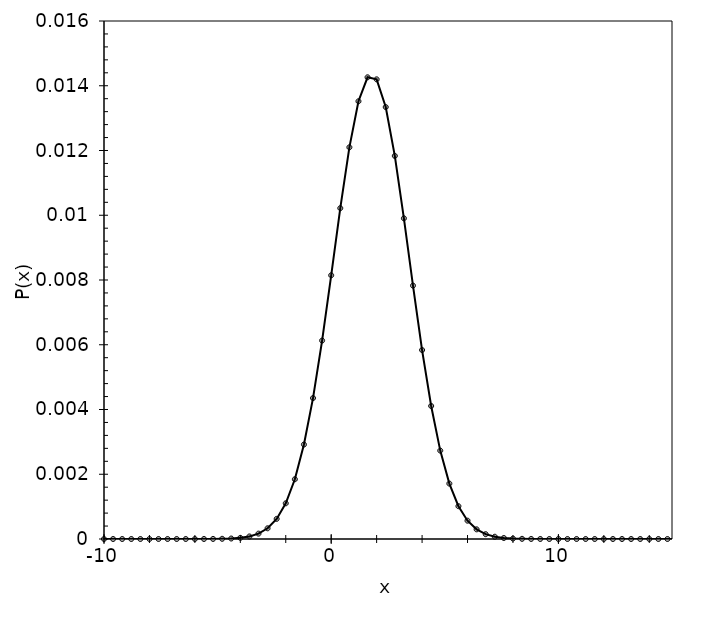
| Category | Product |
|---|---|
| -12.0 | 0 |
| -11.6 | 0 |
| -11.2 | 0 |
| -10.799999999999999 | 0 |
| -10.399999999999999 | 0 |
| -9.999999999999998 | 0 |
| -9.599999999999998 | 0 |
| -9.199999999999998 | 0 |
| -8.799999999999997 | 0 |
| -8.399999999999997 | 0 |
| -7.9999999999999964 | 0 |
| -7.599999999999996 | 0 |
| -7.199999999999996 | 0 |
| -6.799999999999995 | 0 |
| -6.399999999999995 | 0 |
| -5.999999999999995 | 0 |
| -5.599999999999994 | 0 |
| -5.199999999999994 | 0 |
| -4.799999999999994 | 0 |
| -4.399999999999993 | 0 |
| -3.9999999999999933 | 0 |
| -3.5999999999999934 | 0 |
| -3.1999999999999935 | 0 |
| -2.7999999999999936 | 0 |
| -2.3999999999999937 | 0.001 |
| -1.9999999999999938 | 0.001 |
| -1.5999999999999939 | 0.002 |
| -1.199999999999994 | 0.003 |
| -0.7999999999999939 | 0.004 |
| -0.3999999999999939 | 0.006 |
| 6.106226635438361e-15 | 0.008 |
| 0.40000000000000613 | 0.01 |
| 0.8000000000000062 | 0.012 |
| 1.2000000000000062 | 0.014 |
| 1.6000000000000063 | 0.014 |
| 2.000000000000006 | 0.014 |
| 2.400000000000006 | 0.013 |
| 2.800000000000006 | 0.012 |
| 3.200000000000006 | 0.01 |
| 3.600000000000006 | 0.008 |
| 4.000000000000006 | 0.006 |
| 4.400000000000007 | 0.004 |
| 4.800000000000007 | 0.003 |
| 5.200000000000007 | 0.002 |
| 5.600000000000008 | 0.001 |
| 6.000000000000008 | 0.001 |
| 6.400000000000008 | 0 |
| 6.800000000000009 | 0 |
| 7.200000000000009 | 0 |
| 7.600000000000009 | 0 |
| 8.000000000000009 | 0 |
| 8.40000000000001 | 0 |
| 8.80000000000001 | 0 |
| 9.20000000000001 | 0 |
| 9.60000000000001 | 0 |
| 10.00000000000001 | 0 |
| 10.400000000000011 | 0 |
| 10.800000000000011 | 0 |
| 11.200000000000012 | 0 |
| 11.600000000000012 | 0 |
| 12.000000000000012 | 0 |
| 12.400000000000013 | 0 |
| 12.800000000000013 | 0 |
| 13.200000000000014 | 0 |
| 13.600000000000014 | 0 |
| 14.000000000000014 | 0 |
| 14.400000000000015 | 0 |
| 14.800000000000015 | 0 |
| 15.200000000000015 | 0 |
| 15.600000000000016 | 0 |
| 16.000000000000014 | 0 |
| 16.400000000000013 | 0 |
| 16.80000000000001 | 0 |
| 17.20000000000001 | 0 |
| 17.60000000000001 | 0 |
| 18.000000000000007 | 0 |
| 18.400000000000006 | 0 |
| 18.800000000000004 | 0 |
| 19.200000000000003 | 0 |
| 19.6 | 0 |
| 20.0 | 0 |
| 20.4 | 0 |
| 20.799999999999997 | 0 |
| 21.199999999999996 | 0 |
| 21.599999999999994 | 0 |
| 21.999999999999993 | 0 |
| 22.39999999999999 | 0 |
| 22.79999999999999 | 0 |
| 23.19999999999999 | 0 |
| 23.599999999999987 | 0 |
| 23.999999999999986 | 0 |
| 24.399999999999984 | 0 |
| 24.799999999999983 | 0 |
| 25.19999999999998 | 0 |
| 25.59999999999998 | 0 |
| 25.99999999999998 | 0 |
| 26.399999999999977 | 0 |
| 26.799999999999976 | 0 |
| 27.199999999999974 | 0 |
| 27.599999999999973 | 0 |
| 27.99999999999997 | 0 |
| 28.39999999999997 | 0 |
| 28.79999999999997 | 0 |
| 29.199999999999967 | 0 |
| 29.599999999999966 | 0 |
| 29.999999999999964 | 0 |
| 30.399999999999963 | 0 |
| 30.79999999999996 | 0 |
| 31.19999999999996 | 0 |
| 31.59999999999996 | 0 |
| 31.999999999999957 | 0 |
| 32.399999999999956 | 0 |
| 32.799999999999955 | 0 |
| 33.19999999999995 | 0 |
| 33.59999999999995 | 0 |
| 33.99999999999995 | 0 |
| 34.39999999999995 | 0 |
| 34.79999999999995 | 0 |
| 35.199999999999946 | 0 |
| 35.599999999999945 | 0 |
| 35.99999999999994 | 0 |
| 36.39999999999994 | 0 |
| 36.79999999999994 | 0 |
| 37.19999999999994 | 0 |
| 37.59999999999994 | 0 |
| 37.999999999999936 | 0 |
| 38.399999999999935 | 0 |
| 38.79999999999993 | 0 |
| 39.19999999999993 | 0 |
| 39.59999999999993 | 0 |
| 39.99999999999993 | 0 |
| 40.39999999999993 | 0 |
| 40.799999999999926 | 0 |
| 41.199999999999925 | 0 |
| 41.59999999999992 | 0 |
| 41.99999999999992 | 0 |
| 42.39999999999992 | 0 |
| 42.79999999999992 | 0 |
| 43.19999999999992 | 0 |
| 43.599999999999916 | 0 |
| 43.999999999999915 | 0 |
| 44.39999999999991 | 0 |
| 44.79999999999991 | 0 |
| 45.19999999999991 | 0 |
| 45.59999999999991 | 0 |
| 45.99999999999991 | 0 |
| 46.399999999999906 | 0 |
| 46.799999999999905 | 0 |
| 47.1999999999999 | 0 |
| 47.5999999999999 | 0 |
| 47.9999999999999 | 0 |
| 48.3999999999999 | 0 |
| 48.7999999999999 | 0 |
| 49.199999999999896 | 0 |
| 49.599999999999895 | 0 |
| 49.99999999999989 | 0 |
| 50.39999999999989 | 0 |
| 50.79999999999989 | 0 |
| 51.19999999999989 | 0 |
| 51.59999999999989 | 0 |
| 51.999999999999886 | 0 |
| 52.399999999999885 | 0 |
| 52.79999999999988 | 0 |
| 53.19999999999988 | 0 |
| 53.59999999999988 | 0 |
| 53.99999999999988 | 0 |
| 54.39999999999988 | 0 |
| 54.799999999999876 | 0 |
| 55.199999999999875 | 0 |
| 55.59999999999987 | 0 |
| 55.99999999999987 | 0 |
| 56.39999999999987 | 0 |
| 56.79999999999987 | 0 |
| 57.19999999999987 | 0 |
| 57.599999999999866 | 0 |
| 57.999999999999865 | 0 |
| 58.399999999999864 | 0 |
| 58.79999999999986 | 0 |
| 59.19999999999986 | 0 |
| 59.59999999999986 | 0 |
| 59.99999999999986 | 0 |
| 60.39999999999986 | 0 |
| 60.799999999999855 | 0 |
| 61.199999999999854 | 0 |
| 61.59999999999985 | 0 |
| 61.99999999999985 | 0 |
| 62.39999999999985 | 0 |
| 62.79999999999985 | 0 |
| 63.19999999999985 | 0 |
| 63.599999999999845 | 0 |
| 63.999999999999844 | 0 |
| 64.39999999999985 | 0 |
| 64.79999999999986 | 0 |
| 65.19999999999986 | 0 |
| 65.59999999999987 | 0 |
| 65.99999999999987 | 0 |
| 66.39999999999988 | 0 |
| 66.79999999999988 | 0 |
| 67.19999999999989 | 0 |
| 67.5999999999999 | 0 |
| 67.9999999999999 | 0 |
| 68.3999999999999 | 0 |
| 68.79999999999991 | 0 |
| 69.19999999999992 | 0 |
| 69.59999999999992 | 0 |
| 69.99999999999993 | 0 |
| 70.39999999999993 | 0 |
| 70.79999999999994 | 0 |
| 71.19999999999995 | 0 |
| 71.59999999999995 | 0 |
| 71.99999999999996 | 0 |
| 72.39999999999996 | 0 |
| 72.79999999999997 | 0 |
| 73.19999999999997 | 0 |
| 73.59999999999998 | 0 |
| 73.99999999999999 | 0 |
| 74.39999999999999 | 0 |
| 74.8 | 0 |
| 75.2 | 0 |
| 75.60000000000001 | 0 |
| 76.00000000000001 | 0 |
| 76.40000000000002 | 0 |
| 76.80000000000003 | 0 |
| 77.20000000000003 | 0 |
| 77.60000000000004 | 0 |
| 78.00000000000004 | 0 |
| 78.40000000000005 | 0 |
| 78.80000000000005 | 0 |
| 79.20000000000006 | 0 |
| 79.60000000000007 | 0 |
| 80.00000000000007 | 0 |
| 80.40000000000008 | 0 |
| 80.80000000000008 | 0 |
| 81.20000000000009 | 0 |
| 81.6000000000001 | 0 |
| 82.0000000000001 | 0 |
| 82.4000000000001 | 0 |
| 82.80000000000011 | 0 |
| 83.20000000000012 | 0 |
| 83.60000000000012 | 0 |
| 84.00000000000013 | 0 |
| 84.40000000000013 | 0 |
| 84.80000000000014 | 0 |
| 85.20000000000014 | 0 |
| 85.60000000000015 | 0 |
| 86.00000000000016 | 0 |
| 86.40000000000016 | 0 |
| 86.80000000000017 | 0 |
| 87.20000000000017 | 0 |
| 87.60000000000018 | 0 |
| 88.00000000000018 | 0 |
| 88.40000000000019 | 0 |
| 88.8000000000002 | 0 |
| 89.2000000000002 | 0 |
| 89.60000000000021 | 0 |
| 90.00000000000021 | 0 |
| 90.40000000000022 | 0 |
| 90.80000000000022 | 0 |
| 91.20000000000023 | 0 |
| 91.60000000000024 | 0 |
| 92.00000000000024 | 0 |
| 92.40000000000025 | 0 |
| 92.80000000000025 | 0 |
| 93.20000000000026 | 0 |
| 93.60000000000026 | 0 |
| 94.00000000000027 | 0 |
| 94.40000000000028 | 0 |
| 94.80000000000028 | 0 |
| 95.20000000000029 | 0 |
| 95.60000000000029 | 0 |
| 96.0000000000003 | 0 |
| 96.4000000000003 | 0 |
| 96.80000000000031 | 0 |
| 97.20000000000032 | 0 |
| 97.60000000000032 | 0 |
| 98.00000000000033 | 0 |
| 98.40000000000033 | 0 |
| 98.80000000000034 | 0 |
| 99.20000000000034 | 0 |
| 99.60000000000035 | 0 |
| 100.00000000000036 | 0 |
| 100.40000000000036 | 0 |
| 100.80000000000037 | 0 |
| 101.20000000000037 | 0 |
| 101.60000000000038 | 0 |
| 102.00000000000038 | 0 |
| 102.40000000000039 | 0 |
| 102.8000000000004 | 0 |
| 103.2000000000004 | 0 |
| 103.6000000000004 | 0 |
| 104.00000000000041 | 0 |
| 104.40000000000042 | 0 |
| 104.80000000000042 | 0 |
| 105.20000000000043 | 0 |
| 105.60000000000043 | 0 |
| 106.00000000000044 | 0 |
| 106.40000000000045 | 0 |
| 106.80000000000045 | 0 |
| 107.20000000000046 | 0 |
| 107.60000000000046 | 0 |
| 108.00000000000047 | 0 |
| 108.40000000000047 | 0 |
| 108.80000000000048 | 0 |
| 109.20000000000049 | 0 |
| 109.60000000000049 | 0 |
| 110.0000000000005 | 0 |
| 110.4000000000005 | 0 |
| 110.80000000000051 | 0 |
| 111.20000000000051 | 0 |
| 111.60000000000052 | 0 |
| 112.00000000000053 | 0 |
| 112.40000000000053 | 0 |
| 112.80000000000054 | 0 |
| 113.20000000000054 | 0 |
| 113.60000000000055 | 0 |
| 114.00000000000055 | 0 |
| 114.40000000000056 | 0 |
| 114.80000000000057 | 0 |
| 115.20000000000057 | 0 |
| 115.60000000000058 | 0 |
| 116.00000000000058 | 0 |
| 116.40000000000059 | 0 |
| 116.8000000000006 | 0 |
| 117.2000000000006 | 0 |
| 117.6000000000006 | 0 |
| 118.00000000000061 | 0 |
| 118.40000000000062 | 0 |
| 118.80000000000062 | 0 |
| 119.20000000000063 | 0 |
| 119.60000000000063 | 0 |
| 120.00000000000064 | 0 |
| 120.40000000000065 | 0 |
| 120.80000000000065 | 0 |
| 121.20000000000066 | 0 |
| 121.60000000000066 | 0 |
| 122.00000000000067 | 0 |
| 122.40000000000067 | 0 |
| 122.80000000000068 | 0 |
| 123.20000000000068 | 0 |
| 123.60000000000069 | 0 |
| 124.0000000000007 | 0 |
| 124.4000000000007 | 0 |
| 124.80000000000071 | 0 |
| 125.20000000000071 | 0 |
| 125.60000000000072 | 0 |
| 126.00000000000072 | 0 |
| 126.40000000000073 | 0 |
| 126.80000000000074 | 0 |
| 127.20000000000074 | 0 |
| 127.60000000000075 | 0 |
| 128.00000000000074 | 0 |
| 128.40000000000074 | 0 |
| 128.80000000000075 | 0 |
| 129.20000000000076 | 0 |
| 129.60000000000076 | 0 |
| 130.00000000000077 | 0 |
| 130.40000000000077 | 0 |
| 130.80000000000078 | 0 |
| 131.20000000000078 | 0 |
| 131.6000000000008 | 0 |
| 132.0000000000008 | 0 |
| 132.4000000000008 | 0 |
| 132.8000000000008 | 0 |
| 133.2000000000008 | 0 |
| 133.60000000000082 | 0 |
| 134.00000000000082 | 0 |
| 134.40000000000083 | 0 |
| 134.80000000000084 | 0 |
| 135.20000000000084 | 0 |
| 135.60000000000085 | 0 |
| 136.00000000000085 | 0 |
| 136.40000000000086 | 0 |
| 136.80000000000086 | 0 |
| 137.20000000000087 | 0 |
| 137.60000000000088 | 0 |
| 138.00000000000088 | 0 |
| 138.4000000000009 | 0 |
| 138.8000000000009 | 0 |
| 139.2000000000009 | 0 |
| 139.6000000000009 | 0 |
| 140.0000000000009 | 0 |
| 140.40000000000092 | 0 |
| 140.80000000000092 | 0 |
| 141.20000000000093 | 0 |
| 141.60000000000093 | 0 |
| 142.00000000000094 | 0 |
| 142.40000000000094 | 0 |
| 142.80000000000095 | 0 |
| 143.20000000000095 | 0 |
| 143.60000000000096 | 0 |
| 144.00000000000097 | 0 |
| 144.40000000000097 | 0 |
| 144.80000000000098 | 0 |
| 145.20000000000098 | 0 |
| 145.600000000001 | 0 |
| 146.000000000001 | 0 |
| 146.400000000001 | 0 |
| 146.800000000001 | 0 |
| 147.200000000001 | 0 |
| 147.60000000000102 | 0 |
| 148.00000000000102 | 0 |
| 148.40000000000103 | 0 |
| 148.80000000000103 | 0 |
| 149.20000000000104 | 0 |
| 149.60000000000105 | 0 |
| 150.00000000000105 | 0 |
| 150.40000000000106 | 0 |
| 150.80000000000106 | 0 |
| 151.20000000000107 | 0 |
| 151.60000000000107 | 0 |
| 152.00000000000108 | 0 |
| 152.40000000000109 | 0 |
| 152.8000000000011 | 0 |
| 153.2000000000011 | 0 |
| 153.6000000000011 | 0 |
| 154.0000000000011 | 0 |
| 154.4000000000011 | 0 |
| 154.80000000000112 | 0 |
| 155.20000000000113 | 0 |
| 155.60000000000113 | 0 |
| 156.00000000000114 | 0 |
| 156.40000000000114 | 0 |
| 156.80000000000115 | 0 |
| 157.20000000000115 | 0 |
| 157.60000000000116 | 0 |
| 158.00000000000117 | 0 |
| 158.40000000000117 | 0 |
| 158.80000000000118 | 0 |
| 159.20000000000118 | 0 |
| 159.6000000000012 | 0 |
| 160.0000000000012 | 0 |
| 160.4000000000012 | 0 |
| 160.8000000000012 | 0 |
| 161.2000000000012 | 0 |
| 161.60000000000122 | 0 |
| 162.00000000000122 | 0 |
| 162.40000000000123 | 0 |
| 162.80000000000123 | 0 |
| 163.20000000000124 | 0 |
| 163.60000000000124 | 0 |
| 164.00000000000125 | 0 |
| 164.40000000000126 | 0 |
| 164.80000000000126 | 0 |
| 165.20000000000127 | 0 |
| 165.60000000000127 | 0 |
| 166.00000000000128 | 0 |
| 166.40000000000128 | 0 |
| 166.8000000000013 | 0 |
| 167.2000000000013 | 0 |
| 167.6000000000013 | 0 |
| 168.0000000000013 | 0 |
| 168.4000000000013 | 0 |
| 168.80000000000132 | 0 |
| 169.20000000000132 | 0 |
| 169.60000000000133 | 0 |
| 170.00000000000134 | 0 |
| 170.40000000000134 | 0 |
| 170.80000000000135 | 0 |
| 171.20000000000135 | 0 |
| 171.60000000000136 | 0 |
| 172.00000000000136 | 0 |
| 172.40000000000137 | 0 |
| 172.80000000000138 | 0 |
| 173.20000000000138 | 0 |
| 173.6000000000014 | 0 |
| 174.0000000000014 | 0 |
| 174.4000000000014 | 0 |
| 174.8000000000014 | 0 |
| 175.2000000000014 | 0 |
| 175.60000000000142 | 0 |
| 176.00000000000142 | 0 |
| 176.40000000000143 | 0 |
| 176.80000000000143 | 0 |
| 177.20000000000144 | 0 |
| 177.60000000000144 | 0 |
| 178.00000000000145 | 0 |
| 178.40000000000146 | 0 |
| 178.80000000000146 | 0 |
| 179.20000000000147 | 0 |
| 179.60000000000147 | 0 |
| 180.00000000000148 | 0 |
| 180.40000000000148 | 0 |
| 180.8000000000015 | 0 |
| 181.2000000000015 | 0 |
| 181.6000000000015 | 0 |
| 182.0000000000015 | 0 |
| 182.4000000000015 | 0 |
| 182.80000000000152 | 0 |
| 183.20000000000152 | 0 |
| 183.60000000000153 | 0 |
| 184.00000000000153 | 0 |
| 184.40000000000154 | 0 |
| 184.80000000000155 | 0 |
| 185.20000000000155 | 0 |
| 185.60000000000156 | 0 |
| 186.00000000000156 | 0 |
| 186.40000000000157 | 0 |
| 186.80000000000157 | 0 |
| 187.20000000000158 | 0 |
| 187.6000000000016 | 0 |
| 188.0000000000016 | 0 |
| 188.4000000000016 | 0 |
| 188.8000000000016 | 0 |
| 189.2000000000016 | 0 |
| 189.60000000000161 | 0 |
| 190.00000000000162 | 0 |
| 190.40000000000163 | 0 |
| 190.80000000000163 | 0 |
| 191.20000000000164 | 0 |
| 191.60000000000164 | 0 |
| 192.00000000000165 | 0 |
| 192.40000000000165 | 0 |
| 192.80000000000166 | 0 |
| 193.20000000000167 | 0 |
| 193.60000000000167 | 0 |
| 194.00000000000168 | 0 |
| 194.40000000000168 | 0 |
| 194.8000000000017 | 0 |
| 195.2000000000017 | 0 |
| 195.6000000000017 | 0 |
| 196.0000000000017 | 0 |
| 196.4000000000017 | 0 |
| 196.80000000000172 | 0 |
| 197.20000000000172 | 0 |
| 197.60000000000173 | 0 |
| 198.00000000000173 | 0 |
| 198.40000000000174 | 0 |
| 198.80000000000175 | 0 |
| 199.20000000000175 | 0 |
| 199.60000000000176 | 0 |
| 200.00000000000176 | 0 |
| 200.40000000000177 | 0 |
| 200.80000000000177 | 0 |
| 201.20000000000178 | 0 |
| 201.60000000000178 | 0 |
| 202.0000000000018 | 0 |
| 202.4000000000018 | 0 |
| 202.8000000000018 | 0 |
| 203.2000000000018 | 0 |
| 203.6000000000018 | 0 |
| 204.00000000000182 | 0 |
| 204.40000000000182 | 0 |
| 204.80000000000183 | 0 |
| 205.20000000000184 | 0 |
| 205.60000000000184 | 0 |
| 206.00000000000185 | 0 |
| 206.40000000000185 | 0 |
| 206.80000000000186 | 0 |
| 207.20000000000186 | 0 |
| 207.60000000000187 | 0 |
| 208.00000000000188 | 0 |
| 208.40000000000188 | 0 |
| 208.8000000000019 | 0 |
| 209.2000000000019 | 0 |
| 209.6000000000019 | 0 |
| 210.0000000000019 | 0 |
| 210.4000000000019 | 0 |
| 210.80000000000192 | 0 |
| 211.20000000000192 | 0 |
| 211.60000000000193 | 0 |
| 212.00000000000193 | 0 |
| 212.40000000000194 | 0 |
| 212.80000000000194 | 0 |
| 213.20000000000195 | 0 |
| 213.60000000000196 | 0 |
| 214.00000000000196 | 0 |
| 214.40000000000197 | 0 |
| 214.80000000000197 | 0 |
| 215.20000000000198 | 0 |
| 215.60000000000198 | 0 |
| 216.000000000002 | 0 |
| 216.400000000002 | 0 |
| 216.800000000002 | 0 |
| 217.200000000002 | 0 |
| 217.600000000002 | 0 |
| 218.00000000000202 | 0 |
| 218.40000000000202 | 0 |
| 218.80000000000203 | 0 |
| 219.20000000000203 | 0 |
| 219.60000000000204 | 0 |
| 220.00000000000205 | 0 |
| 220.40000000000205 | 0 |
| 220.80000000000206 | 0 |
| 221.20000000000206 | 0 |
| 221.60000000000207 | 0 |
| 222.00000000000207 | 0 |
| 222.40000000000208 | 0 |
| 222.8000000000021 | 0 |
| 223.2000000000021 | 0 |
| 223.6000000000021 | 0 |
| 224.0000000000021 | 0 |
| 224.4000000000021 | 0 |
| 224.80000000000211 | 0 |
| 225.20000000000212 | 0 |
| 225.60000000000213 | 0 |
| 226.00000000000213 | 0 |
| 226.40000000000214 | 0 |
| 226.80000000000214 | 0 |
| 227.20000000000215 | 0 |
| 227.60000000000215 | 0 |
| 228.00000000000216 | 0 |
| 228.40000000000217 | 0 |
| 228.80000000000217 | 0 |
| 229.20000000000218 | 0 |
| 229.60000000000218 | 0 |
| 230.0000000000022 | 0 |
| 230.4000000000022 | 0 |
| 230.8000000000022 | 0 |
| 231.2000000000022 | 0 |
| 231.6000000000022 | 0 |
| 232.00000000000222 | 0 |
| 232.40000000000222 | 0 |
| 232.80000000000223 | 0 |
| 233.20000000000223 | 0 |
| 233.60000000000224 | 0 |
| 234.00000000000225 | 0 |
| 234.40000000000225 | 0 |
| 234.80000000000226 | 0 |
| 235.20000000000226 | 0 |
| 235.60000000000227 | 0 |
| 236.00000000000227 | 0 |
| 236.40000000000228 | 0 |
| 236.80000000000229 | 0 |
| 237.2000000000023 | 0 |
| 237.6000000000023 | 0 |
| 238.0000000000023 | 0 |
| 238.4000000000023 | 0 |
| 238.8000000000023 | 0 |
| 239.20000000000232 | 0 |
| 239.60000000000232 | 0 |
| 240.00000000000233 | 0 |
| 240.40000000000234 | 0 |
| 240.80000000000234 | 0 |
| 241.20000000000235 | 0 |
| 241.60000000000235 | 0 |
| 242.00000000000236 | 0 |
| 242.40000000000236 | 0 |
| 242.80000000000237 | 0 |
| 243.20000000000238 | 0 |
| 243.60000000000238 | 0 |
| 244.0000000000024 | 0 |
| 244.4000000000024 | 0 |
| 244.8000000000024 | 0 |
| 245.2000000000024 | 0 |
| 245.6000000000024 | 0 |
| 246.00000000000242 | 0 |
| 246.40000000000242 | 0 |
| 246.80000000000243 | 0 |
| 247.20000000000243 | 0 |
| 247.60000000000244 | 0 |
| 248.00000000000244 | 0 |
| 248.40000000000245 | 0 |
| 248.80000000000246 | 0 |
| 249.20000000000246 | 0 |
| 249.60000000000247 | 0 |
| 250.00000000000247 | 0 |
| 250.40000000000248 | 0 |
| 250.80000000000248 | 0 |
| 251.2000000000025 | 0 |
| 251.6000000000025 | 0 |
| 252.0000000000025 | 0 |
| 252.4000000000025 | 0 |
| 252.8000000000025 | 0 |
| 253.20000000000252 | 0 |
| 253.60000000000252 | 0 |
| 254.00000000000253 | 0 |
| 254.40000000000254 | 0 |
| 254.80000000000254 | 0 |
| 255.20000000000255 | 0 |
| 255.60000000000255 | 0 |
| 256.00000000000256 | 0 |
| 256.40000000000254 | 0 |
| 256.8000000000025 | 0 |
| 257.2000000000025 | 0 |
| 257.60000000000247 | 0 |
| 258.00000000000244 | 0 |
| 258.4000000000024 | 0 |
| 258.8000000000024 | 0 |
| 259.2000000000024 | 0 |
| 259.60000000000235 | 0 |
| 260.00000000000233 | 0 |
| 260.4000000000023 | 0 |
| 260.8000000000023 | 0 |
| 261.20000000000226 | 0 |
| 261.60000000000224 | 0 |
| 262.0000000000022 | 0 |
| 262.4000000000022 | 0 |
| 262.80000000000217 | 0 |
| 263.20000000000215 | 0 |
| 263.6000000000021 | 0 |
| 264.0000000000021 | 0 |
| 264.4000000000021 | 0 |
| 264.80000000000206 | 0 |
| 265.20000000000203 | 0 |